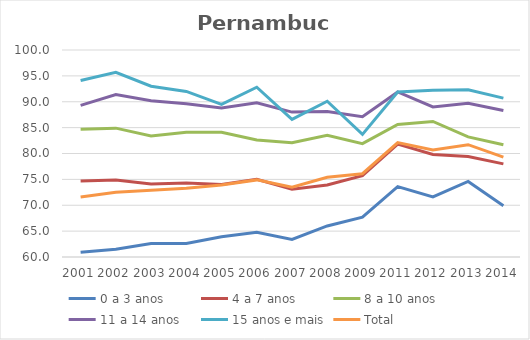
| Category | 0 a 3 anos | 4 a 7 anos | 8 a 10 anos | 11 a 14 anos | 15 anos e mais | Total |
|---|---|---|---|---|---|---|
| 2001.0 | 60.9 | 74.7 | 84.7 | 89.3 | 94.1 | 71.6 |
| 2002.0 | 61.5 | 74.9 | 84.9 | 91.4 | 95.7 | 72.5 |
| 2003.0 | 62.6 | 74.1 | 83.4 | 90.2 | 93 | 72.9 |
| 2004.0 | 62.6 | 74.3 | 84.1 | 89.6 | 92 | 73.3 |
| 2005.0 | 63.9 | 74 | 84.1 | 88.8 | 89.5 | 73.9 |
| 2006.0 | 64.8 | 75 | 82.6 | 89.8 | 92.8 | 74.9 |
| 2007.0 | 63.4 | 73.1 | 82.1 | 88 | 86.6 | 73.5 |
| 2008.0 | 66 | 73.9 | 83.5 | 88.1 | 90.1 | 75.4 |
| 2009.0 | 67.7 | 75.7 | 81.9 | 87.1 | 83.7 | 76.1 |
| 2011.0 | 73.6 | 81.8 | 85.6 | 91.9 | 91.9 | 82.1 |
| 2012.0 | 71.6 | 79.8 | 86.2 | 89 | 92.2 | 80.7 |
| 2013.0 | 74.6 | 79.4 | 83.2 | 89.7 | 92.3 | 81.7 |
| 2014.0 | 69.9 | 78 | 81.7 | 88.3 | 90.7 | 79.3 |